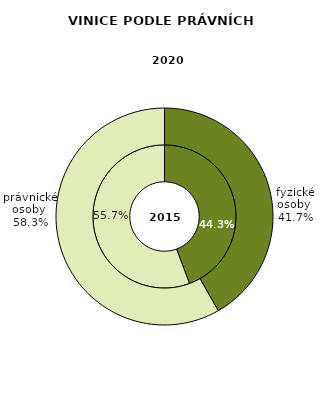
| Category | 2015 | 2020 |
|---|---|---|
| fyzické osoby  | 7840.089 | 7555.562 |
| právnické osoby  | 9848.5 | 10543.803 |